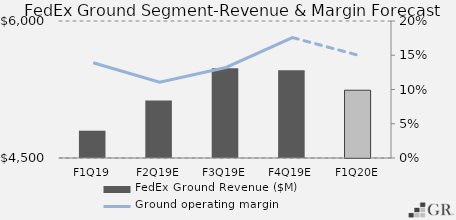
| Category | FedEx Ground Revenue ($M) |
|---|---|
|  F1Q19  | 4798.91 |
|  F2Q19E  | 5128.978 |
|  F3Q19E  | 5483.078 |
|  F4Q19E  | 5461.194 |
|  F1Q20E  | 5242.052 |